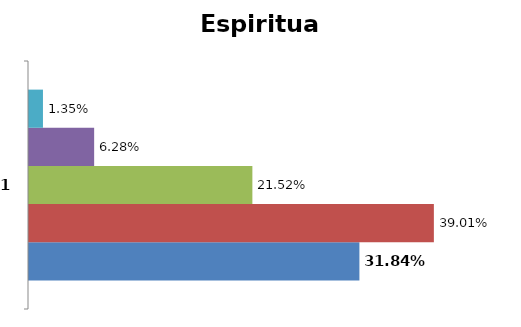
| Category | Alto | Mediano | Bajo | Ninguno | No sabe |
|---|---|---|---|---|---|
| 0 | 0.318 | 0.39 | 0.215 | 0.063 | 0.013 |